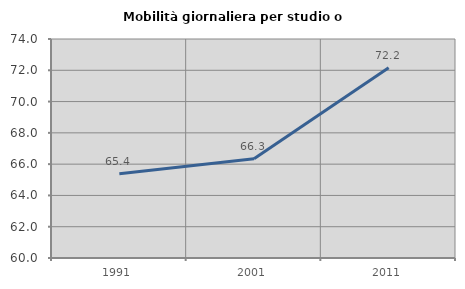
| Category | Mobilità giornaliera per studio o lavoro |
|---|---|
| 1991.0 | 65.38 |
| 2001.0 | 66.338 |
| 2011.0 | 72.167 |